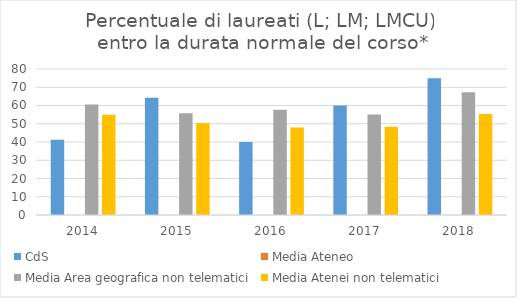
| Category | CdS | Media Ateneo | Media Area geografica non telematici | Media Atenei non telematici |
|---|---|---|---|---|
| 2014.0 | 41.2 |  | 60.5 | 54.9 |
| 2015.0 | 64.3 |  | 55.7 | 50.4 |
| 2016.0 | 40 |  | 57.7 | 48 |
| 2017.0 | 60 |  | 55.1 | 48.4 |
| 2018.0 | 75 |  | 67.2 | 55.3 |